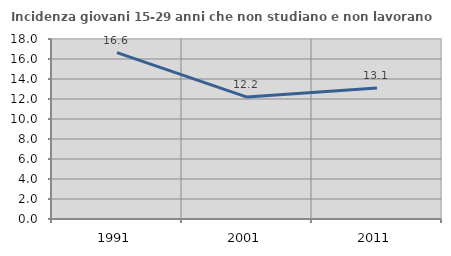
| Category | Incidenza giovani 15-29 anni che non studiano e non lavorano  |
|---|---|
| 1991.0 | 16.643 |
| 2001.0 | 12.193 |
| 2011.0 | 13.089 |